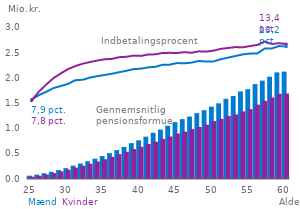
| Category | Mænd | Kvinder |
|---|---|---|
| 25.0 | 65721.755 | 46318.705 |
| 26.0 | 86444.072 | 64547.088 |
| 27.0 | 113520.258 | 87666.193 |
| 28.0 | 142454.831 | 116163.066 |
| 29.0 | 177167.275 | 150193.447 |
| 30.0 | 215538.528 | 185340.761 |
| 31.0 | 266142.649 | 225343.555 |
| 32.0 | 307859.67 | 263228.555 |
| 33.0 | 352278.285 | 301750.439 |
| 34.0 | 404382.925 | 349134.069 |
| 35.0 | 456295.244 | 392242.056 |
| 36.0 | 514370.601 | 441592.112 |
| 37.0 | 575538.758 | 492742.029 |
| 38.0 | 636944.714 | 540857.531 |
| 39.0 | 712644.686 | 594267.931 |
| 40.0 | 768390.185 | 640660.438 |
| 41.0 | 841621.202 | 695056.483 |
| 42.0 | 917104.58 | 740360.515 |
| 43.0 | 981890.602 | 797889.144 |
| 44.0 | 1058298.234 | 844969.297 |
| 45.0 | 1130408.826 | 902929.971 |
| 46.0 | 1189877.31 | 940310.167 |
| 47.0 | 1240535.885 | 989574.114 |
| 48.0 | 1308780.896 | 1033474.47 |
| 49.0 | 1367618.548 | 1079854.505 |
| 50.0 | 1437179.313 | 1151042.077 |
| 51.0 | 1503634.484 | 1194857.692 |
| 52.0 | 1593324.972 | 1249661.373 |
| 53.0 | 1647859.04 | 1282262.567 |
| 54.0 | 1740427.318 | 1342901.509 |
| 55.0 | 1783306.886 | 1386980.739 |
| 56.0 | 1885326.929 | 1476884.476 |
| 57.0 | 1954762.809 | 1552696.523 |
| 58.0 | 2033483.334 | 1618841.066 |
| 59.0 | 2118157.426 | 1693166.42 |
| 60.0 | 2133610.564 | 1698251.257 |